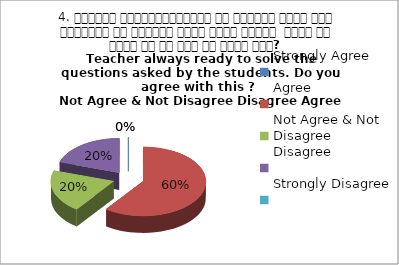
| Category | 4. शिक्षक विद्यार्थियों के द्वारा पूछे गये प्रश्नो का समाधान करने हेतु तत्पर  रहते है क्या आप इस बात से सहमत हैं? 
 Teacher always ready to solve the questions asked by the students. Do you agree with this ? 
 Not Agree & Not Disagree Disagree Agree Agree |
|---|---|
| Strongly Agree | 0 |
| Agree | 3 |
| Not Agree & Not Disagree | 1 |
| Disagree | 1 |
| Strongly Disagree | 0 |